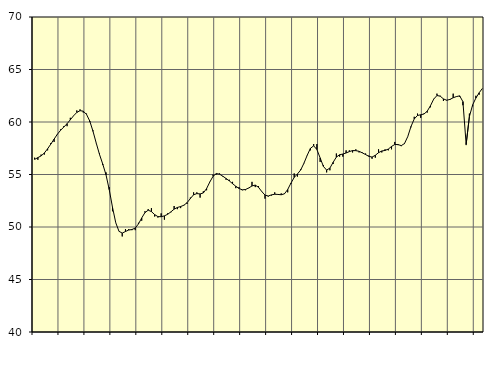
| Category | Piggar | Samtliga fast anställda (inkl. fast anställda utomlands)1 |
|---|---|---|
| nan | 56.6 | 56.44 |
| 87.0 | 56.4 | 56.61 |
| 87.0 | 56.9 | 56.77 |
| 87.0 | 56.9 | 57.05 |
| nan | 57.3 | 57.45 |
| 88.0 | 58 | 57.9 |
| 88.0 | 58.1 | 58.37 |
| 88.0 | 58.8 | 58.83 |
| nan | 59.3 | 59.21 |
| 89.0 | 59.6 | 59.52 |
| 89.0 | 59.6 | 59.84 |
| 89.0 | 60.4 | 60.21 |
| nan | 60.6 | 60.59 |
| 90.0 | 61.1 | 60.91 |
| 90.0 | 61.2 | 61.08 |
| 90.0 | 60.9 | 61.03 |
| nan | 60.8 | 60.72 |
| 91.0 | 60 | 60.09 |
| 91.0 | 59.2 | 59.11 |
| 91.0 | 58 | 57.98 |
| nan | 57 | 56.91 |
| 92.0 | 55.9 | 55.99 |
| 92.0 | 55.2 | 54.97 |
| 92.0 | 53.8 | 53.56 |
| nan | 51.5 | 51.88 |
| 93.0 | 50.4 | 50.41 |
| 93.0 | 49.6 | 49.59 |
| 93.0 | 49.1 | 49.42 |
| nan | 49.8 | 49.57 |
| 94.0 | 49.8 | 49.71 |
| 94.0 | 49.7 | 49.76 |
| 94.0 | 49.7 | 49.9 |
| nan | 50.4 | 50.29 |
| 95.0 | 50.6 | 50.86 |
| 95.0 | 51.5 | 51.37 |
| 95.0 | 51.7 | 51.6 |
| nan | 51.8 | 51.47 |
| 96.0 | 51 | 51.18 |
| 96.0 | 50.9 | 50.99 |
| 96.0 | 51.3 | 50.98 |
| nan | 50.7 | 51.06 |
| 97.0 | 51.3 | 51.21 |
| 97.0 | 51.4 | 51.44 |
| 97.0 | 52 | 51.7 |
| nan | 51.7 | 51.86 |
| 98.0 | 51.8 | 51.95 |
| 98.0 | 52.1 | 52.07 |
| 98.0 | 52.2 | 52.32 |
| nan | 52.8 | 52.71 |
| 99.0 | 53.3 | 53.07 |
| 99.0 | 53.3 | 53.18 |
| 99.0 | 52.8 | 53.15 |
| nan | 53.4 | 53.24 |
| 0.0 | 53.5 | 53.66 |
| 0.0 | 54.3 | 54.29 |
| 0.0 | 55 | 54.83 |
| nan | 55 | 55.09 |
| 1.0 | 55.1 | 55.03 |
| 1.0 | 54.8 | 54.84 |
| 1.0 | 54.5 | 54.62 |
| nan | 54.5 | 54.39 |
| 2.0 | 54.3 | 54.13 |
| 2.0 | 53.7 | 53.88 |
| 2.0 | 53.8 | 53.67 |
| nan | 53.5 | 53.54 |
| 3.0 | 53.5 | 53.57 |
| 3.0 | 53.7 | 53.72 |
| 3.0 | 54.3 | 53.91 |
| nan | 53.8 | 53.99 |
| 4.0 | 53.9 | 53.78 |
| 4.0 | 53.4 | 53.38 |
| 4.0 | 52.7 | 53.04 |
| nan | 52.9 | 52.95 |
| 5.0 | 53 | 53.06 |
| 5.0 | 53.3 | 53.12 |
| 5.0 | 53.1 | 53.1 |
| nan | 53.2 | 53.07 |
| 6.0 | 53.2 | 53.16 |
| 6.0 | 53.3 | 53.57 |
| 6.0 | 54.1 | 54.18 |
| nan | 55.1 | 54.72 |
| 7.0 | 54.8 | 55.05 |
| 7.0 | 55.5 | 55.43 |
| 7.0 | 56.1 | 56.07 |
| nan | 56.8 | 56.82 |
| 8.0 | 57.3 | 57.49 |
| 8.0 | 57.9 | 57.73 |
| 8.0 | 57.9 | 57.38 |
| nan | 56.2 | 56.58 |
| 9.0 | 55.9 | 55.77 |
| 9.0 | 55.2 | 55.42 |
| 9.0 | 55.4 | 55.61 |
| nan | 56 | 56.16 |
| 10.0 | 57 | 56.66 |
| 10.0 | 56.7 | 56.88 |
| 10.0 | 56.7 | 56.95 |
| nan | 57.3 | 57.05 |
| 11.0 | 57.3 | 57.18 |
| 11.0 | 57.1 | 57.28 |
| 11.0 | 57.4 | 57.27 |
| nan | 57.1 | 57.21 |
| 12.0 | 57.1 | 57.06 |
| 12.0 | 57 | 56.9 |
| 12.0 | 56.8 | 56.73 |
| nan | 56.5 | 56.66 |
| 13.0 | 56.6 | 56.83 |
| 13.0 | 57.4 | 57.08 |
| 13.0 | 57.1 | 57.24 |
| nan | 57.4 | 57.29 |
| 14.0 | 57.3 | 57.42 |
| 14.0 | 57.4 | 57.67 |
| 14.0 | 58.1 | 57.86 |
| nan | 57.8 | 57.85 |
| 15.0 | 57.7 | 57.75 |
| 15.0 | 57.9 | 57.95 |
| 15.0 | 58.6 | 58.61 |
| nan | 59.5 | 59.57 |
| 16.0 | 60.5 | 60.29 |
| 16.0 | 60.8 | 60.62 |
| 16.0 | 60.4 | 60.69 |
| nan | 60.8 | 60.76 |
| 17.0 | 60.9 | 61.03 |
| 17.0 | 61.4 | 61.55 |
| 17.0 | 62.2 | 62.18 |
| nan | 62.7 | 62.52 |
| 18.0 | 62.5 | 62.46 |
| 18.0 | 62 | 62.2 |
| 18.0 | 62.1 | 62.07 |
| nan | 62.1 | 62.15 |
| 19.0 | 62.7 | 62.31 |
| 19.0 | 62.4 | 62.42 |
| 19.0 | 62.4 | 62.49 |
| nan | 61.6 | 61.94 |
| 20.0 | 57.8 | 57.88 |
| 20.0 | 60.8 | 60.52 |
| 20.0 | 61.5 | 61.63 |
| nan | 62.5 | 62.28 |
| 21.0 | 62.6 | 62.78 |
| 21.0 | 63.2 | 63.2 |